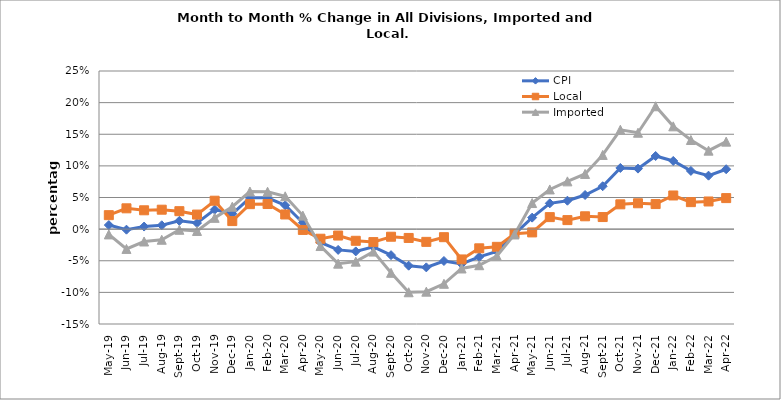
| Category | CPI | Local | Imported |
|---|---|---|---|
| 2019-05-01 | 0.006 | 0.022 | -0.008 |
| 2019-06-01 | -0.001 | 0.033 | -0.031 |
| 2019-07-01 | 0.004 | 0.03 | -0.02 |
| 2019-08-01 | 0.006 | 0.031 | -0.017 |
| 2019-09-01 | 0.013 | 0.028 | -0.001 |
| 2019-10-01 | 0.01 | 0.023 | -0.003 |
| 2019-11-01 | 0.031 | 0.045 | 0.018 |
| 2019-12-01 | 0.024 | 0.013 | 0.035 |
| 2020-01-01 | 0.049 | 0.039 | 0.059 |
| 2020-02-01 | 0.05 | 0.04 | 0.059 |
| 2020-03-01 | 0.038 | 0.023 | 0.052 |
| 2020-04-01 | 0.01 | -0.001 | 0.021 |
| 2020-05-01 | -0.021 | -0.015 | -0.027 |
| 2020-06-01 | -0.033 | -0.01 | -0.055 |
| 2020-07-01 | -0.035 | -0.018 | -0.051 |
| 2020-08-01 | -0.028 | -0.02 | -0.036 |
| 2020-09-01 | -0.041 | -0.012 | -0.069 |
| 2020-10-01 | -0.058 | -0.014 | -0.1 |
| 2020-11-01 | -0.06 | -0.02 | -0.099 |
| 2020-12-01 | -0.05 | -0.013 | -0.086 |
| 2021-01-01 | -0.055 | -0.048 | -0.062 |
| 2021-02-01 | -0.044 | -0.03 | -0.057 |
| 2021-03-01 | -0.035 | -0.028 | -0.043 |
| 2021-04-01 | -0.008 | -0.007 | -0.008 |
| 2021-05-01 | 0.018 | -0.005 | 0.041 |
| 2021-06-01 | 0.041 | 0.019 | 0.063 |
| 2021-07-01 | 0.045 | 0.014 | 0.075 |
| 2021-08-01 | 0.054 | 0.02 | 0.087 |
| 2021-09-01 | 0.068 | 0.019 | 0.117 |
| 2021-10-01 | 0.097 | 0.039 | 0.157 |
| 2021-11-01 | 0.096 | 0.041 | 0.152 |
| 2021-12-01 | 0.116 | 0.04 | 0.194 |
| 2022-01-01 | 0.108 | 0.053 | 0.163 |
| 2022-02-01 | 0.092 | 0.043 | 0.141 |
| 2022-03-01 | 0.085 | 0.044 | 0.124 |
| 2022-04-01 | 0.095 | 0.049 | 0.138 |